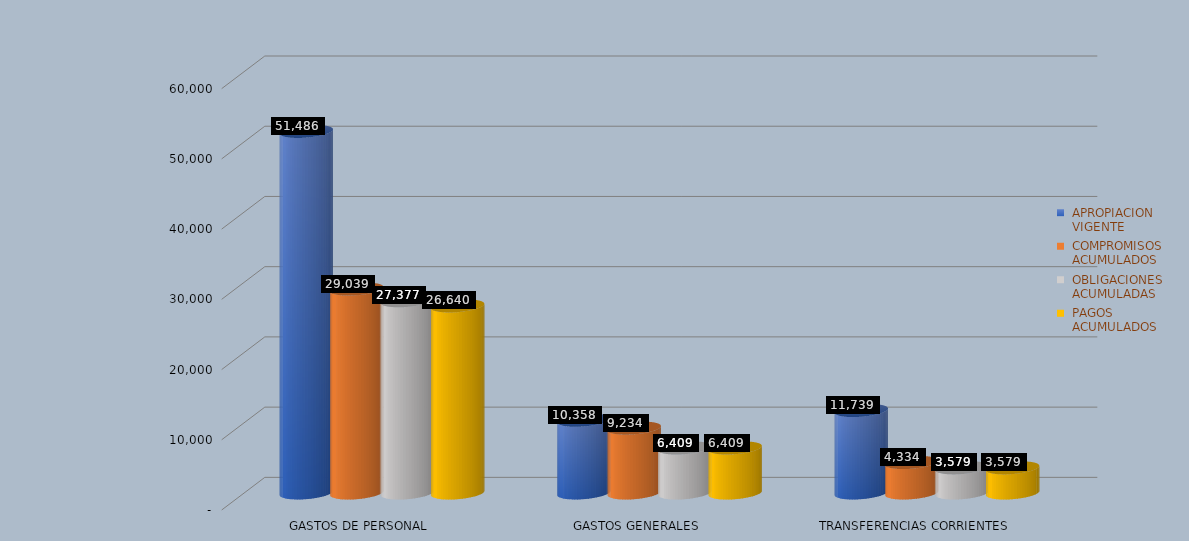
| Category |  APROPIACION
 VIGENTE |  COMPROMISOS
 ACUMULADOS |  OBLIGACIONES
 ACUMULADAS |  PAGOS
 ACUMULADOS |
|---|---|---|---|---|
| GASTOS DE PERSONAL | 51485.706 | 29038.576 | 27377.31 | 26640.073 |
| GASTOS GENERALES | 10357.915 | 9233.972 | 6409.422 | 6409.422 |
| TRANSFERENCIAS CORRIENTES | 11739.403 | 4334.141 | 3579.061 | 3579.061 |